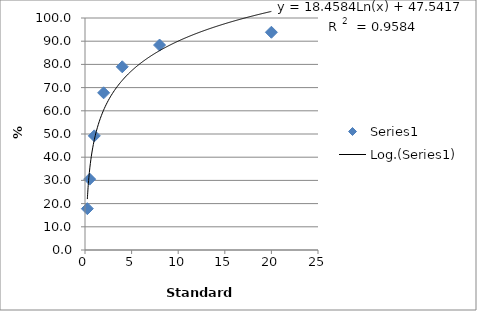
| Category | Series 0 |
|---|---|
| 20.0 | 93.854 |
| 8.0 | 88.338 |
| 4.0 | 78.971 |
| 2.0 | 67.753 |
| 1.0 | 49.204 |
| 0.5 | 30.544 |
| 0.25 | 17.808 |